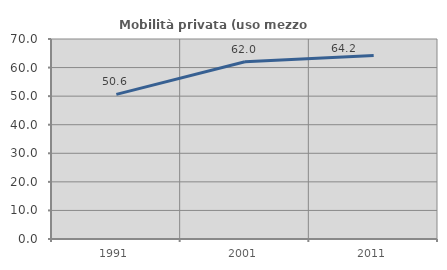
| Category | Mobilità privata (uso mezzo privato) |
|---|---|
| 1991.0 | 50.62 |
| 2001.0 | 62.046 |
| 2011.0 | 64.192 |